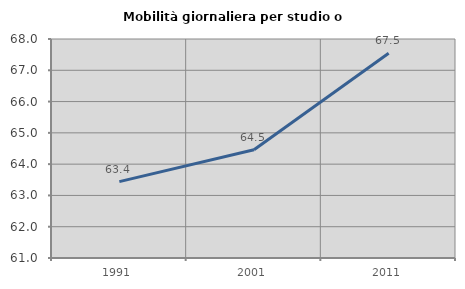
| Category | Mobilità giornaliera per studio o lavoro |
|---|---|
| 1991.0 | 63.442 |
| 2001.0 | 64.463 |
| 2011.0 | 67.546 |